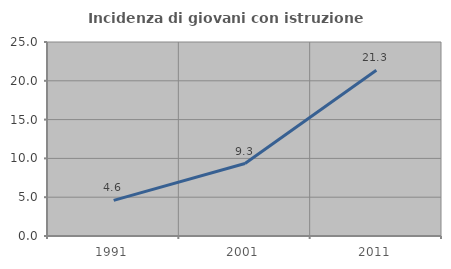
| Category | Incidenza di giovani con istruzione universitaria |
|---|---|
| 1991.0 | 4.59 |
| 2001.0 | 9.339 |
| 2011.0 | 21.35 |